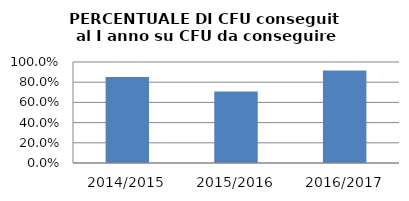
| Category | 2014/2015 2015/2016 2016/2017 |
|---|---|
| 2014/2015 | 0.852 |
| 2015/2016 | 0.708 |
| 2016/2017 | 0.917 |